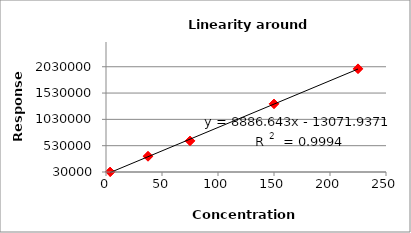
| Category | Series 0 |
|---|---|
| 3.75 | 32780 |
| 3.75 | 33106 |
| 3.75 | 34637 |
| 37.5 | 319828 |
| 37.5 | 331593 |
| 37.5 | 334361 |
| 75.0 | 620637 |
| 75.0 | 621572 |
| 75.0 | 620549 |
| 150.0 | 1324279 |
| 150.0 | 1326600 |
| 150.0 | 1323506 |
| 225.0 | 1993748 |
| 225.0 | 1998510 |
| 225.0 | 1984905 |